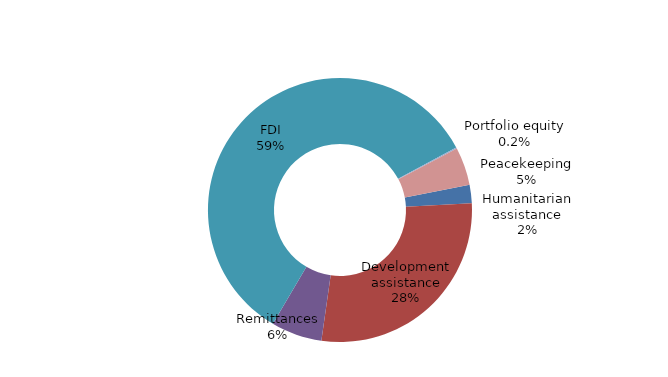
| Category | Series 0 |
|---|---|
| Humanitarian assistance | 0.098 |
| Development assistance | 1.22 |
| OOFs gross | 0 |
| Remittances | 0.271 |
| FDI | 2.549 |
| Short and long term debt | 0 |
| Portfolio equity | 0.007 |
| Peacekeeping | 0.202 |